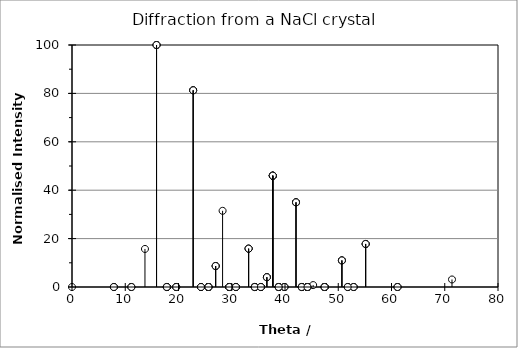
| Category | Series 0 |
|---|---|
| 0.0 | 0 |
| 7.8608277601205385 | 0 |
| 15.87470705026374 | 100 |
| 24.223804477909724 | 0 |
| 33.166184161186514 | 15.85 |
| 7.8608277601205385 | 0 |
| 11.152333796207 | 0 |
| 17.807565247489393 | 0 |
| 25.626082053884623 | 0 |
| 34.32636323782313 | 0 |
| 15.87470705026374 | 100 |
| 17.807565247489393 | 0 |
| 22.757793123641928 | 81.277 |
| 29.545961140735336 | 0 |
| 37.708328083528365 | 45.997 |
| 24.223804477909724 | 0 |
| 25.626082053884623 | 0 |
| 29.545961140735336 | 0 |
| 35.468450977694175 | 0 |
| 43.14418007490426 | 0 |
| 33.166184161186514 | 15.85 |
| 34.32636323782313 | 0 |
| 37.708328083528365 | 45.997 |
| 43.14418007490426 | 0 |
| 50.684857045839365 | 10.98 |
| 7.8608277601205385 | 0 |
| 11.152333796207 | 0 |
| 17.807565247489393 | 0 |
| 25.626082053884623 | 0 |
| 34.32636323782313 | 0 |
| 11.152333796207 | 0 |
| 13.702936753073079 | 15.723 |
| 19.573154702014556 | 0 |
| 26.975269736021 | 8.675 |
| 35.468450977694175 | 0 |
| 17.807565247489393 | 0 |
| 19.573154702014556 | 0 |
| 24.223804477909724 | 0 |
| 30.77956287094359 | 0 |
| 38.810497431705286 | 0 |
| 25.626082053884623 | 0 |
| 26.975269736021 | 8.675 |
| 30.77956287094359 | 0 |
| 36.59500742351316 | 4.047 |
| 44.2171150525385 | 0 |
| 34.32636323782313 | 0 |
| 35.468450977694175 | 0 |
| 38.810497431705286 | 0 |
| 44.2171150525385 | 0 |
| 51.782541813269326 | 0 |
| 15.87470705026374 | 100 |
| 17.807565247489393 | 0 |
| 22.757793123641928 | 81.277 |
| 29.545961140735336 | 0 |
| 37.708328083528365 | 45.997 |
| 17.807565247489393 | 0 |
| 19.573154702014556 | 0 |
| 24.223804477909724 | 0 |
| 30.77956287094359 | 0 |
| 38.810497431705286 | 0 |
| 22.757793123641928 | 81.277 |
| 24.223804477909724 | 0 |
| 28.279678036659256 | 31.479 |
| 34.32636323782313 | 0 |
| 42.06863041856202 | 34.989 |
| 29.545961140735336 | 0 |
| 30.77956287094359 | 0 |
| 34.32636323782313 | 0 |
| 39.903432008361975 | 0 |
| 47.4353487752644 | 0 |
| 37.708328083528365 | 45.997 |
| 38.810497431705286 | 0 |
| 42.06863041856202 | 34.989 |
| 47.4353487752644 | 0 |
| 55.14529299047725 | 17.785 |
| 24.223804477909724 | 0 |
| 25.626082053884623 | 0 |
| 29.545961140735336 | 0 |
| 35.468450977694175 | 0 |
| 43.14418007490426 | 0 |
| 25.626082053884623 | 0 |
| 26.975269736021 | 8.675 |
| 30.77956287094359 | 0 |
| 36.59500742351316 | 4.047 |
| 44.2171150525385 | 0 |
| 29.545961140735336 | 0 |
| 30.77956287094359 | 0 |
| 34.32636323782313 | 0 |
| 39.903432008361975 | 0 |
| 47.4353487752644 | 0 |
| 35.468450977694175 | 0 |
| 36.59500742351316 | 4.047 |
| 39.903432008361975 | 0 |
| 45.28895209466844 | 0.792 |
| 52.89047621169163 | 0 |
| 43.14418007490426 | 0 |
| 44.2171150525385 | 0 |
| 47.4353487752644 | 0 |
| 52.89047621169163 | 0 |
| 61.13245359805375 | 0 |
| 33.166184161186514 | 15.85 |
| 34.32636323782313 | 0 |
| 37.708328083528365 | 45.997 |
| 43.14418007490426 | 0 |
| 50.684857045839365 | 10.98 |
| 34.32636323782313 | 0 |
| 35.468450977694175 | 0 |
| 38.810497431705286 | 0 |
| 44.2171150525385 | 0 |
| 51.782541813269326 | 0 |
| 37.708328083528365 | 45.997 |
| 38.810497431705286 | 0 |
| 42.06863041856202 | 34.989 |
| 47.4353487752644 | 0 |
| 55.14529299047725 | 17.785 |
| 43.14418007490426 | 0 |
| 44.2171150525385 | 0 |
| 47.4353487752644 | 0 |
| 52.89047621169163 | 0 |
| 61.13245359805375 | 0 |
| 50.684857045839365 | 10.98 |
| 51.782541813269326 | 0 |
| 55.14529299047725 | 17.785 |
| 61.13245359805375 | 0 |
| 71.36112409093246 | 3.112 |